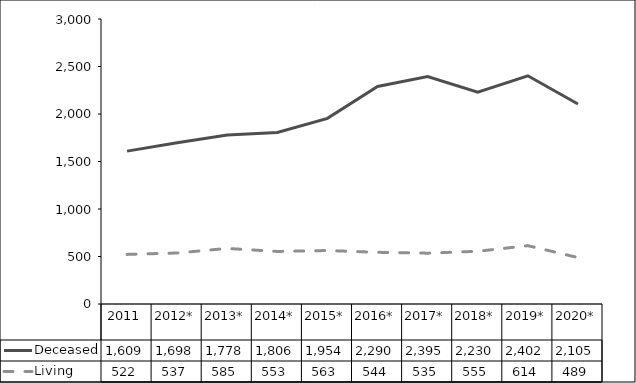
| Category | Deceased | Living |
|---|---|---|
| 2011 | 1609 | 522 |
| 2012* | 1698 | 537 |
| 2013* | 1778 | 585 |
| 2014* | 1806 | 553 |
| 2015* | 1954 | 563 |
| 2016* | 2290 | 544 |
| 2017* | 2395 | 535 |
| 2018* | 2230 | 555 |
| 2019* | 2402 | 614 |
| 2020* | 2105 | 489 |